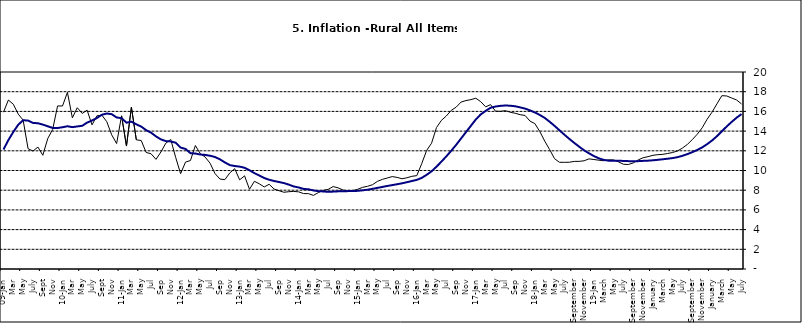
| Category | Series 0 | Series 1 |
|---|---|---|
| 09-Jan | 15.918 | 12.128 |
| Feb | 17.154 | 13.086 |
| Mar | 16.729 | 13.912 |
| Apr | 15.727 | 14.644 |
| May | 15.113 | 15.104 |
| June | 12.213 | 15.067 |
| July | 11.974 | 14.832 |
| Aug | 12.38 | 14.796 |
| Sept | 11.548 | 14.661 |
| Oct | 13.242 | 14.488 |
| Nov | 14.164 | 14.321 |
|  | 16.557 | 14.316 |
| 10-Jan | 16.548 | 14.39 |
| Feb | 17.934 | 14.494 |
| Mar | 15.346 | 14.401 |
| Apr | 16.373 | 14.473 |
| May | 15.794 | 14.54 |
| June | 16.126 | 14.862 |
| July | 14.634 | 15.072 |
| Aug | 15.556 | 15.33 |
| Sept | 15.616 | 15.658 |
| Oct | 14.955 | 15.786 |
| Nov | 13.616 | 15.719 |
| Dec | 12.735 | 15.385 |
| 11-Jan | 15.553 | 15.311 |
| Feb | 12.482 | 14.856 |
| Mar | 16.422 | 14.956 |
| Apr | 13.117 | 14.687 |
| May | 13.041 | 14.457 |
| Jun | 11.83 | 14.095 |
| Jul | 11.699 | 13.84 |
| Aug | 11.13 | 13.464 |
| Sep | 11.878 | 13.156 |
| Oct | 12.778 | 12.985 |
| Nov | 13.147 | 12.95 |
| Dec | 11.326 | 12.824 |
| 12-Jan | 9.678 | 12.33 |
| Feb | 10.856 | 12.188 |
| Mar | 11.014 | 11.76 |
| Apr | 12.536 | 11.724 |
| May | 11.712 | 11.621 |
| Jun | 11.36 | 11.582 |
| Jul | 10.733 | 11.499 |
| Aug | 9.683 | 11.368 |
| Sep | 9.132 | 11.131 |
| Oct | 9.071 | 10.82 |
| Nov | 9.758 | 10.548 |
| Dec | 10.183 | 10.455 |
| 13-Jan | 9.052 | 10.394 |
| Feb | 9.457 | 10.276 |
| Mar | 8.091 | 10.025 |
| Apr | 8.907 | 9.732 |
| May | 8.647 | 9.483 |
| Jun | 8.333 | 9.236 |
| Jul | 8.6 | 9.063 |
| Aug | 8.12 | 8.933 |
| Sep | 7.95 | 8.832 |
| Oct | 7.791 | 8.722 |
| Nov | 7.849 | 8.565 |
| Dec | 7.879 | 8.378 |
| 14-Jan | 7.832 | 8.277 |
| Feb | 7.657 | 8.13 |
| Mar | 7.65 | 8.092 |
| Apr | 7.473 | 7.973 |
| May | 7.761 | 7.901 |
| Jun | 7.98 | 7.874 |
| Jul | 8.086 | 7.834 |
| Aug | 8.368 | 7.858 |
| Sep | 8.244 | 7.883 |
| Oct | 8.019 | 7.903 |
| Nov | 7.898 | 7.906 |
| Dec | 7.955 | 7.913 |
| 15-Jan | 8.094 | 7.935 |
| Feb | 8.291 | 7.988 |
| Mar | 8.396 | 8.05 |
| Apr | 8.556 | 8.14 |
| May | 8.896 | 8.236 |
| Jun | 9.098 | 8.331 |
| Jul | 9.238 | 8.429 |
| Aug | 9.382 | 8.516 |
| Sep | 9.3 | 8.606 |
| Oct | 9.162 | 8.7 |
| Nov | 9.261 | 8.813 |
| Dec | 9.41 | 8.933 |
| 16-Jan | 9.48 | 9.047 |
| Feb | 10.692 | 9.249 |
| Mar | 12.038 | 9.559 |
| Apr | 12.767 | 9.917 |
| May | 14.349 | 10.384 |
| Jun | 15.088 | 10.897 |
| Jul | 15.533 | 11.433 |
| Aug | 16.103 | 12.002 |
| Sep | 16.428 | 12.601 |
| Oct | 16.947 | 13.25 |
| Nov | 17.099 | 13.898 |
| Dec | 17.195 | 14.54 |
| 17-Jan | 17.341 | 15.183 |
| Feb | 16.982 | 15.696 |
| Mar | 16.466 | 16.054 |
| Apr | 16.687 | 16.369 |
| May | 16.023 | 16.497 |
| Jun | 16.007 | 16.563 |
| Jul | 16.078 | 16.6 |
| Aug | 15.914 | 16.577 |
| Sep | 15.812 | 16.52 |
| Oct | 15.666 | 16.411 |
| Nov | 15.587 | 16.285 |
| Dec | 15.018 | 16.104 |
| 18-Jan | 14.756 | 15.892 |
| Feb | 13.957 | 15.638 |
| Mar | 12.987 | 15.339 |
| Apr | 12.126 | 14.95 |
| May | 11.199 | 14.53 |
| June | 10.832 | 14.083 |
| July | 10.831 | 13.636 |
| August | 10.838 | 13.209 |
| September | 10.924 | 12.804 |
| October | 10.927 | 12.418 |
| November | 10.986 | 12.049 |
| December | 11.183 | 11.746 |
| 19-Jan | 11.115 | 11.462 |
| February | 11.048 | 11.234 |
| March | 10.99 | 11.078 |
| April | 11.08 | 10.997 |
| May | 11.075 | 10.988 |
| June | 10.874 | 10.99 |
| July | 10.636 | 10.972 |
| August | 10.609 | 10.951 |
| September | 10.771 | 10.937 |
| October | 11.074 | 10.95 |
| November | 11.296 | 10.977 |
| December | 11.406 | 10.998 |
| January | 11.543 | 11.037 |
| February | 11.606 | 11.086 |
| March | 11.639 | 11.141 |
| April | 11.728 | 11.197 |
| May | 11.826 | 11.261 |
| June | 11.988 | 11.355 |
| July | 12.28 | 11.493 |
| August | 12.651 | 11.664 |
| September | 13.14 | 11.864 |
| October | 13.68 | 12.086 |
| November | 14.335 | 12.346 |
| December | 15.2 | 12.67 |
| January | 15.918 | 13.043 |
| February | 16.766 | 13.482 |
| March | 17.596 | 13.985 |
| April | 17.566 | 14.475 |
| May | 17.358 | 14.935 |
| June | 17.159 | 15.362 |
| July | 16.753 | 15.726 |